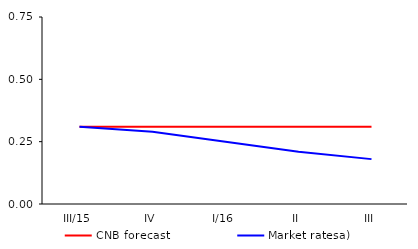
| Category | CNB forecast | Market ratesa) |
|---|---|---|
| III/15 | 0.31 | 0.31 |
| IV | 0.31 | 0.29 |
| I/16 | 0.31 | 0.25 |
| II | 0.31 | 0.21 |
| III | 0.31 | 0.18 |